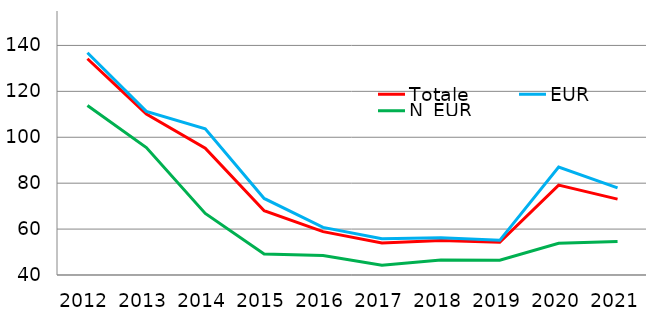
| Category | Totale | EUR | N_EUR |
|---|---|---|---|
| 2012.0 | 134.208 | 136.789 | 113.847 |
| 2013.0 | 110.156 | 111.298 | 95.506 |
| 2014.0 | 95.205 | 103.644 | 66.81 |
| 2015.0 | 67.991 | 73.337 | 49.149 |
| 2016.0 | 58.896 | 60.717 | 48.508 |
| 2017.0 | 53.975 | 55.752 | 44.227 |
| 2018.0 | 55.043 | 56.186 | 46.516 |
| 2019.0 | 54.255 | 55.103 | 46.436 |
| 2020.0 | 79.181 | 87.033 | 53.808 |
| 2021.0 | 73.047 | 77.946 | 54.589 |